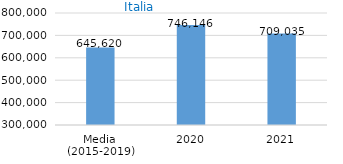
| Category | Italia |
|---|---|
| Media 
(2015-2019) | 645619.6 |
| 2020 | 746146 |
| 2021 | 709035 |